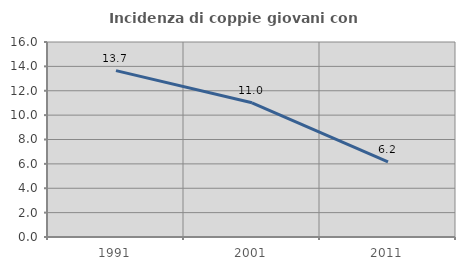
| Category | Incidenza di coppie giovani con figli |
|---|---|
| 1991.0 | 13.651 |
| 2001.0 | 11.014 |
| 2011.0 | 6.162 |